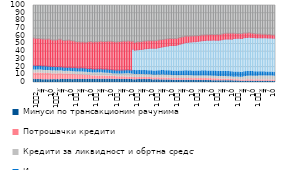
| Category | Минуси по трансакционим рачунима | Потрошачки кредити | Кредити за ликвидност и обртна средства | Инвестициони кредити | Готовински кредити* | Остали кредити и потраживања* | Стамбени кредити  |
|---|---|---|---|---|---|---|---|
| 1
2010. | 4.063 | 8.368 | 3.88 | 5.988 | 0 | 35.528 | 42.181 |
| 2 | 3.832 | 8.428 | 3.853 | 5.909 | 0 | 35.387 | 42.598 |
| 3 | 3.883 | 8.573 | 3.858 | 5.797 | 0 | 34.938 | 42.958 |
| 4 | 3.804 | 8.508 | 3.981 | 5.781 | 0 | 35.113 | 42.82 |
| 5 | 3.815 | 8.389 | 4.039 | 6.09 | 0 | 34.689 | 42.985 |
| 6 | 3.623 | 8.282 | 3.974 | 5.926 | 0 | 34.545 | 43.655 |
| 7 | 3.581 | 8.176 | 3.963 | 5.873 | 0 | 34.923 | 43.491 |
| 8 | 3.685 | 7.992 | 3.943 | 5.849 | 0 | 34.765 | 43.771 |
| 9 | 3.65 | 7.923 | 3.897 | 5.837 | 0 | 35.045 | 43.655 |
| 10 | 3.651 | 7.886 | 3.892 | 5.789 | 0 | 35.343 | 43.445 |
| 11 | 3.722 | 7.749 | 3.884 | 5.677 | 0 | 34.939 | 44.034 |
| 12 | 3.492 | 7.661 | 3.883 | 5.598 | 0 | 34.515 | 44.857 |
| 1
2011. | 3.745 | 7.551 | 3.829 | 5.552 | 0 | 34.664 | 44.665 |
| 2 | 3.66 | 7.49 | 3.813 | 5.488 | 0 | 34.82 | 44.735 |
| 3 | 3.816 | 7.415 | 3.861 | 5.552 | 0 | 34.889 | 44.474 |
| 4 | 3.733 | 7.49 | 3.86 | 5.451 | 0 | 35.498 | 43.974 |
| 5 | 4.149 | 7.316 | 3.779 | 5.329 | 0 | 35.494 | 43.938 |
| 6 | 3.884 | 7.253 | 3.642 | 5.385 | 0 | 34.984 | 44.857 |
| 7 | 3.811 | 7.084 | 3.521 | 5.306 | 0 | 34.842 | 45.441 |
| 8 | 3.983 | 7.027 | 3.514 | 5.298 | 0 | 35.032 | 45.15 |
| 9 | 3.997 | 6.941 | 3.563 | 5.26 | 0 | 35.362 | 44.882 |
| 10 | 4.169 | 6.814 | 3.582 | 5.198 | 0 | 35.517 | 44.724 |
| 11 | 4.043 | 6.7 | 3.575 | 5.29 | 0 | 35.045 | 45.351 |
| 12 | 3.695 | 6.619 | 3.662 | 5.256 | 0 | 34.908 | 45.863 |
| 1 
2012. | 3.928 | 6.458 | 3.636 | 5.325 | 0 | 34.415 | 46.241 |
| 2 | 3.764 | 6.336 | 3.632 | 5.331 | 0 | 33.897 | 47.044 |
| 3 | 3.873 | 6.213 | 3.649 | 5.285 | 0 | 33.962 | 47.021 |
| 4 | 3.832 | 6.11 | 3.719 | 5.32 | 0 | 33.996 | 47.026 |
| 5 | 3.92 | 6.004 | 3.745 | 5.392 | 0 | 33.464 | 47.478 |
| 6 | 3.868 | 6.004 | 3.757 | 5.445 | 0 | 33.677 | 47.253 |
| 7 | 3.925 | 5.725 | 3.718 | 5.489 | 0 | 33.613 | 47.534 |
| 8 | 3.948 | 5.571 | 3.635 | 5.462 | 0 | 33.662 | 47.727 |
| 9 | 4.062 | 5.109 | 3.643 | 5.439 | 0 | 34.563 | 47.188 |
| 10 | 4.19 | 4.907 | 3.738 | 5.413 | 0 | 34.907 | 46.849 |
| 11 | 4.137 | 4.781 | 3.813 | 5.386 | 0 | 34.986 | 46.901 |
| 12 | 3.91 | 4.673 | 3.767 | 5.323 | 0 | 34.88 | 47.451 |
| 1 
2013. | 4.222 | 4.56 | 3.759 | 5.27 | 0 | 35.199 | 46.995 |
| 2 | 4.087 | 4.436 | 3.844 | 5.284 | 0 | 35.2 | 47.154 |
| 3 | 4.139 | 4.32 | 4.066 | 5.321 | 0 | 35.167 | 46.992 |
| 4 | 4.107 | 4.286 | 4.071 | 5.307 | 0 | 35.635 | 46.6 |
| 5 | 4.342 | 4.217 | 4.014 | 5.303 | 0 | 35.704 | 46.424 |
| 6 | 4.138 | 4.162 | 3.965 | 5.339 | 0 | 35.531 | 46.87 |
| 7 | 4.26 | 4.098 | 3.854 | 5.335 | 0 | 35.81 | 46.646 |
| 8 | 4.203 | 4.045 | 3.785 | 5.379 | 0 | 35.983 | 46.609 |
| 9 | 4.231 | 3.965 | 3.683 | 5.381 | 0 | 36.17 | 46.574 |
| 10 | 4.351 | 3.884 | 3.588 | 5.341 | 0 | 36.518 | 46.323 |
| 11 | 4.232 | 3.819 | 3.499 | 5.321 | 0 | 36.686 | 46.447 |
| 12 | 3.96 | 3.758 | 3.469 | 5.29 | 0 | 36.753 | 46.773 |
| 1 
2014. | 4.165 | 3.666 | 3.389 | 5.268 | 0 | 36.457 | 47.059 |
| 2 | 3.934 | 3.59 | 3.39 | 5.282 | 0 | 36.557 | 47.251 |
| 3 | 4.062 | 3.532 | 3.439 | 5.245 | 0 | 36.773 | 46.952 |
| 4 | 3.986 | 3.477 | 3.463 | 5.223 | 0 | 37.028 | 46.827 |
| 5 | 4.052 | 3.398 | 3.46 | 5.208 | 0 | 37.219 | 46.666 |
| 6 | 4.017 | 3.334 | 3.784 | 5.214 | 0 | 37.269 | 46.387 |
| 7 | 3.987 | 3.274 | 4 | 5.199 | 0 | 37.327 | 46.215 |
| 8 | 3.905 | 3.226 | 4.077 | 5.22 | 0 | 37.253 | 46.324 |
| 9 | 3.931 | 3.167 | 4.141 | 5.211 | 0 | 37.384 | 46.169 |
| 10 | 3.944 | 3.132 | 4.242 | 5.19 | 0 | 37.484 | 46.012 |
| 11 | 3.803 | 3.094 | 4.256 | 5.227 | 0 | 37.306 | 46.318 |
| 12 | 3.593 | 2.758 | 4.312 | 5.177 | 27.268 | 10.392 | 46.503 |
| 1 
2015. | 3.68 | 2.666 | 4.078 | 5.082 | 26.354 | 10.16 | 47.984 |
| 2 | 3.68 | 2.636 | 4.031 | 5.061 | 26.953 | 10.239 | 47.403 |
| 3 | 3.816 | 2.624 | 4.019 | 5.061 | 27.133 | 10.175 | 47.176 |
| 4 | 3.77 | 2.655 | 3.966 | 5.104 | 27.364 | 10.168 | 46.976 |
| 5 | 3.771 | 2.654 | 3.9 | 5.138 | 27.538 | 10.118 | 46.884 |
| 6 | 3.769 | 2.659 | 3.858 | 5.222 | 27.8 | 10.102 | 46.593 |
| 7 | 3.755 | 2.66 | 3.8 | 5.254 | 28.248 | 10.068 | 46.218 |
| 8 | 3.761 | 2.662 | 3.731 | 5.284 | 28.475 | 10.084 | 46.005 |
| 9 | 3.744 | 2.663 | 3.663 | 5.332 | 28.805 | 10.075 | 45.721 |
| 10 | 3.739 | 2.658 | 3.597 | 5.409 | 28.932 | 9.971 | 45.698 |
| 11 | 3.653 | 2.641 | 3.526 | 5.498 | 29.138 | 9.935 | 45.612 |
| 12 | 3.347 | 2.613 | 3.467 | 5.566 | 29.421 | 9.939 | 45.649 |
| 1 
2016. | 3.487 | 2.574 | 3.425 | 5.607 | 29.262 | 9.929 | 45.716 |
| 2 | 3.463 | 2.543 | 3.469 | 5.628 | 29.355 | 9.894 | 45.65 |
| 3 | 3.482 | 2.554 | 3.579 | 5.73 | 29.744 | 9.83 | 45.083 |
| 4 | 3.304 | 2.581 | 3.677 | 5.763 | 30.184 | 9.779 | 44.715 |
| 5 | 3.452 | 2.573 | 3.732 | 5.799 | 30.471 | 9.662 | 44.312 |
| 6 | 3.352 | 2.548 | 3.752 | 5.829 | 30.93 | 9.554 | 44.038 |
| 7 | 3.239 | 2.51 | 3.765 | 5.816 | 31.445 | 9.443 | 43.782 |
| 8 | 3.306 | 2.465 | 3.728 | 5.799 | 31.92 | 9.399 | 43.384 |
| 9 | 3.233 | 2.425 | 3.674 | 5.873 | 32.338 | 9.261 | 43.197 |
| 10 | 3.236 | 2.379 | 3.641 | 5.884 | 32.771 | 9.193 | 42.895 |
| 11 | 3.153 | 2.345 | 3.655 | 5.903 | 32.994 | 9.141 | 42.808 |
| 12 | 2.855 | 2.336 | 3.685 | 5.89 | 33.314 | 9.015 | 42.905 |
| 1 
2017. | 3.056 | 2.3 | 3.623 | 5.861 | 33.261 | 8.949 | 42.95 |
| 2 | 2.952 | 2.267 | 3.65 | 5.866 | 33.677 | 8.861 | 42.727 |
| 3 | 2.94 | 2.253 | 3.73 | 5.959 | 34.275 | 8.72 | 42.123 |
| 4 | 2.831 | 2.28 | 3.748 | 6.005 | 34.848 | 8.669 | 41.619 |
| 5 | 2.976 | 2.289 | 3.688 | 6.048 | 35.259 | 8.67 | 41.069 |
| 6 | 2.91 | 2.307 | 3.655 | 6.153 | 35.92 | 8.467 | 40.588 |
| 7 | 2.932 | 2.336 | 3.629 | 6.201 | 36.428 | 8.388 | 40.085 |
| 8 | 2.986 | 2.37 | 3.614 | 6.222 | 36.909 | 8.352 | 39.547 |
| 9 | 2.899 | 2.33 | 3.517 | 6.276 | 37.163 | 8.047 | 39.769 |
| 10 | 2.964 | 2.364 | 3.504 | 6.303 | 37.353 | 8.039 | 39.473 |
| 11 | 2.885 | 2.395 | 3.348 | 6.332 | 37.611 | 7.963 | 39.467 |
| 12 | 2.598 | 2.402 | 3.422 | 6.399 | 38.273 | 7.548 | 39.358 |
| 1 
2018. | 2.761 | 2.379 | 3.353 | 6.375 | 38.144 | 7.651 | 39.338 |
| 2 | 2.644 | 2.39 | 3.35 | 6.392 | 38.363 | 7.632 | 39.228 |
| 3 | 2.65 | 2.435 | 3.374 | 6.477 | 38.578 | 7.484 | 39.002 |
| 4 | 2.56 | 2.495 | 3.408 | 6.533 | 38.919 | 7.462 | 38.624 |
| 5 | 2.648 | 2.519 | 3.413 | 6.553 | 39.03 | 7.46 | 38.378 |
| 6 | 2.523 | 2.547 | 3.441 | 6.602 | 39.336 | 7.379 | 38.173 |
| 7 | 2.546 | 2.556 | 3.389 | 6.632 | 39.569 | 7.357 | 37.951 |
| 8 | 2.505 | 2.564 | 3.344 | 6.65 | 39.678 | 7.33 | 37.93 |
| 9 | 2.47 | 2.518 | 3.315 | 6.659 | 39.866 | 7.306 | 37.867 |
| 10 | 2.544 | 2.502 | 3.265 | 6.661 | 40.055 | 7.33 | 37.644 |
| 11 | 2.396 | 2.472 | 3.249 | 6.712 | 40.155 | 7.35 | 37.667 |
| 12 | 2.305 | 2.456 | 3.265 | 6.754 | 40.283 | 7.198 | 37.739 |
| 1 
2019. | 2.426 | 2.426 | 3.227 | 6.727 | 40.165 | 7.219 | 37.81 |
| 2 | 2.336 | 2.382 | 3.228 | 6.741 | 40.234 | 7.255 | 37.824 |
| 3 | 2.326 | 2.153 | 3.253 | 6.77 | 40.512 | 7.379 | 37.608 |
| 4 | 2.25 | 2.163 | 3.353 | 6.675 | 40.747 | 7.379 | 37.434 |
| 5 | 2.296 | 2.064 | 3.371 | 6.655 | 41.027 | 7.418 | 37.17 |
| 6 | 2.281 | 2.078 | 3.443 | 6.774 | 41.678 | 7.539 | 36.208 |
| 7 | 2.313 | 2.031 | 3.439 | 6.722 | 41.93 | 7.575 | 35.989 |
| 8 | 2.287 | 1.903 | 3.425 | 6.693 | 42.122 | 7.546 | 36.023 |
| 9 | 2.282 | 1.849 | 3.351 | 6.661 | 42.318 | 7.563 | 35.976 |
| 10 | 2.297 | 1.748 | 3.34 | 6.68 | 42.369 | 7.636 | 35.931 |
| 11 | 2.214 | 1.625 | 3.187 | 6.777 | 42.503 | 7.636 | 36.057 |
| 12 | 2.069 | 1.601 | 3.258 | 6.7 | 43.653 | 6.67 | 36.048 |
| 1 
2020. | 2.161 | 1.593 | 3.268 | 6.611 | 43.675 | 6.502 | 36.189 |
| 2 | 2.089 | 1.584 | 3.332 | 6.564 | 43.915 | 6.312 | 36.205 |
| 3 | 2.003 | 1.542 | 3.428 | 6.515 | 44.069 | 6.144 | 36.299 |
| 4 | 1.715 | 1.548 | 3.478 | 6.528 | 43.965 | 6.324 | 36.442 |
| 5 | 1.652 | 1.601 | 3.664 | 6.494 | 43.838 | 6.5 | 36.251 |
| 6 | 1.699 | 1.654 | 4.202 | 6.417 | 44.097 | 6.23 | 35.7 |
| 7 | 1.691 | 1.683 | 4.45 | 6.314 | 44.243 | 5.822 | 35.797 |
| 8 | 1.711 | 1.724 | 4.589 | 6.22 | 44.238 | 5.951 | 35.567 |
| 9 | 1.678 | 1.769 | 4.796 | 6.113 | 44.268 | 6.002 | 35.373 |
| 10 | 1.773 | 1.781 | 4.748 | 6.074 | 44.196 | 5.78 | 35.648 |
| 11 | 1.757 | 1.784 | 4.705 | 6.003 | 44.244 | 5.624 | 35.884 |
| 12 | 1.581 | 1.8 | 4.721 | 5.952 | 44.267 | 5.433 | 36.245 |
| 1 
2021. | 1.685 | 1.782 | 4.684 | 5.878 | 44.088 | 5.316 | 36.567 |
| 2 | 1.629 | 1.774 | 4.709 | 5.795 | 44.146 | 5.189 | 36.758 |
| 3 | 1.661 | 1.762 | 4.87 | 5.705 | 44.127 | 4.966 | 36.908 |
| 4 | 1.538 | 1.77 | 5.027 | 5.623 | 44.142 | 4.819 | 37.081 |
| 5 | 1.598 | 1.77 | 5.034 | 5.507 | 44.112 | 4.747 | 37.232 |
| 6 | 1.568 | 1.765 | 5.101 | 5.464 | 44.077 | 4.691 | 37.333 |
| 7 | 1.564 | 1.764 | 5.079 | 5.386 | 44.172 | 4.574 | 37.462 |
| 8 | 1.61 | 1.754 | 5.06 | 5.284 | 44.178 | 4.494 | 37.619 |
| 9 | 1.541 | 1.741 | 5.096 | 5.236 | 44.203 | 4.379 | 37.804 |
| 10 | 1.52 | 1.724 | 5.115 | 5.239 | 44.147 | 4.273 | 37.981 |
| 11 | 1.497 | 1.704 | 5.168 | 5.214 | 44.018 | 4.235 | 38.164 |
| 12 | 1.352 | 1.701 | 5.209 | 5.139 | 43.986 | 4.141 | 38.472 |